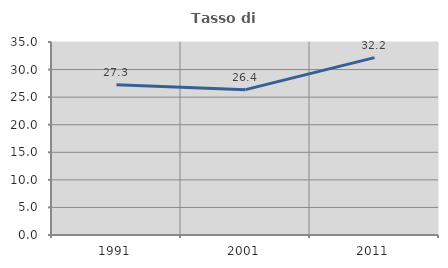
| Category | Tasso di occupazione   |
|---|---|
| 1991.0 | 27.253 |
| 2001.0 | 26.357 |
| 2011.0 | 32.172 |